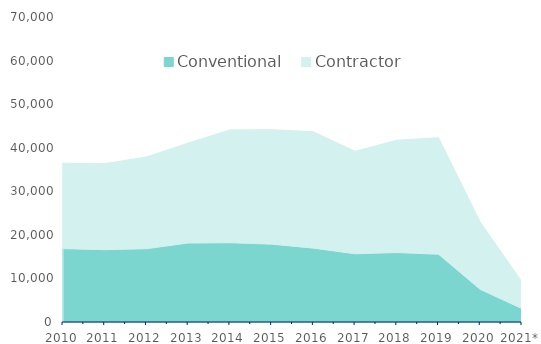
| Category | Conventional | Contractor |
|---|---|---|
| 2010 | 16836 | 19607 |
| 2011 | 16593 | 19728 |
| 2012 | 16820 | 21064 |
| 2013 | 18117 | 22926 |
| 2014 | 18185 | 25905 |
| 2015 | 17870 | 26277 |
| 2016 | 16952 | 26701 |
| 2017 | 15652 | 23510 |
| 2018 | 15938 | 25776 |
| 2019 | 15549 | 26745 |
| 2020 | 7487 | 15408 |
| 2021* | 3074 | 6126 |